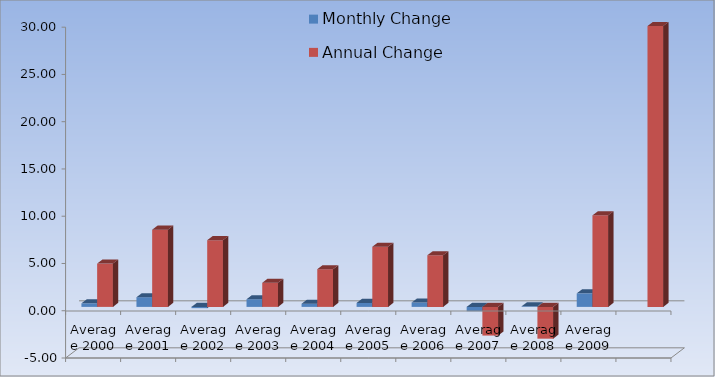
| Category | Monthly Change | Annual Change |
|---|---|---|
| Average 2000 | 0.377 | 4.584 |
| Average 2001 | 1.023 | 8.169 |
| Average 2002 | -0.133 | 7.057 |
| Average 2003 | 0.81 | 2.554 |
| Average 2004 | 0.335 | 3.988 |
| Average 2005 | 0.419 | 6.364 |
| Average 2006 | 0.458 | 5.46 |
| Average 2007 | -0.462 | -3.034 |
| Average 2008 | 0.066 | -3.363 |
| Average 2009 | 1.432 | 9.682 |